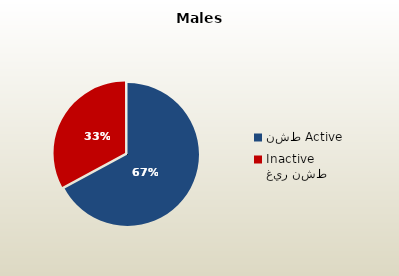
| Category | الذكور القطريين  Qatari Males |
|---|---|
| نشط Active | 69198 |
| غير نشط Inactive | 33915 |